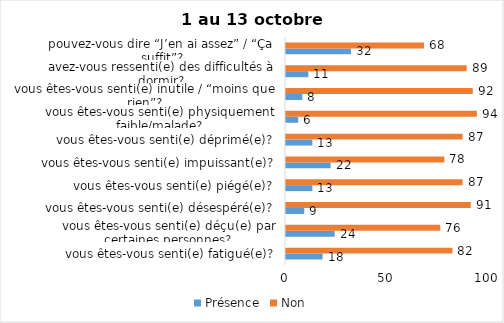
| Category | Présence | Non |
|---|---|---|
| vous êtes-vous senti(e) fatigué(e)? | 18 | 82 |
| vous êtes-vous senti(e) déçu(e) par certaines personnes? | 24 | 76 |
| vous êtes-vous senti(e) désespéré(e)? | 9 | 91 |
| vous êtes-vous senti(e) piégé(e)? | 13 | 87 |
| vous êtes-vous senti(e) impuissant(e)? | 22 | 78 |
| vous êtes-vous senti(e) déprimé(e)? | 13 | 87 |
| vous êtes-vous senti(e) physiquement faible/malade? | 6 | 94 |
| vous êtes-vous senti(e) inutile / “moins que rien”? | 8 | 92 |
| avez-vous ressenti(e) des difficultés à dormir? | 11 | 89 |
| pouvez-vous dire “J’en ai assez” / “Ça suffit”? | 32 | 68 |